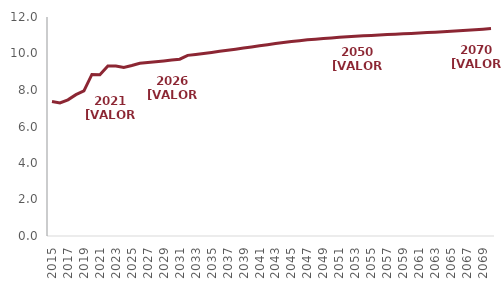
| Category | IRPF |
|---|---|
| 2015.0 | 7.369 |
| 2016.0 | 7.288 |
| 2017.0 | 7.461 |
| 2018.0 | 7.746 |
| 2019.0 | 7.951 |
| 2020.0 | 8.852 |
| 2021.0 | 8.836 |
| 2022.0 | 9.314 |
| 2023.0 | 9.317 |
| 2024.0 | 9.231 |
| 2025.0 | 9.342 |
| 2026.0 | 9.469 |
| 2027.0 | 9.509 |
| 2028.0 | 9.55 |
| 2029.0 | 9.593 |
| 2030.0 | 9.639 |
| 2031.0 | 9.688 |
| 2032.0 | 9.898 |
| 2033.0 | 9.95 |
| 2034.0 | 10.003 |
| 2035.0 | 10.06 |
| 2036.0 | 10.119 |
| 2037.0 | 10.178 |
| 2038.0 | 10.238 |
| 2039.0 | 10.3 |
| 2040.0 | 10.361 |
| 2041.0 | 10.423 |
| 2042.0 | 10.483 |
| 2043.0 | 10.542 |
| 2044.0 | 10.599 |
| 2045.0 | 10.653 |
| 2046.0 | 10.703 |
| 2047.0 | 10.748 |
| 2048.0 | 10.787 |
| 2049.0 | 10.823 |
| 2050.0 | 10.854 |
| 2051.0 | 10.887 |
| 2052.0 | 10.916 |
| 2053.0 | 10.943 |
| 2054.0 | 10.968 |
| 2055.0 | 10.992 |
| 2056.0 | 11.014 |
| 2057.0 | 11.036 |
| 2058.0 | 11.057 |
| 2059.0 | 11.078 |
| 2060.0 | 11.1 |
| 2061.0 | 11.122 |
| 2062.0 | 11.144 |
| 2063.0 | 11.167 |
| 2064.0 | 11.191 |
| 2065.0 | 11.218 |
| 2066.0 | 11.243 |
| 2067.0 | 11.27 |
| 2068.0 | 11.3 |
| 2069.0 | 11.333 |
| 2070.0 | 11.368 |